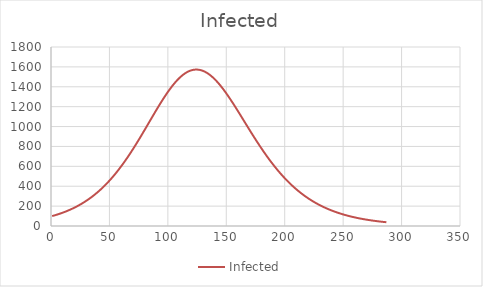
| Category | Infected |
|---|---|
| 1.0 | 100 |
| 2.0 | 103.313 |
| 3.0 | 106.732 |
| 4.0 | 110.26 |
| 5.0 | 113.9 |
| 6.0 | 117.654 |
| 7.0 | 121.528 |
| 8.0 | 125.523 |
| 9.0 | 129.643 |
| 10.0 | 133.892 |
| 11.0 | 138.273 |
| 12.0 | 142.79 |
| 13.0 | 147.447 |
| 14.0 | 152.248 |
| 15.0 | 157.196 |
| 16.0 | 162.295 |
| 17.0 | 167.549 |
| 18.0 | 172.963 |
| 19.0 | 178.54 |
| 20.0 | 184.284 |
| 21.0 | 190.201 |
| 22.0 | 196.293 |
| 23.0 | 202.565 |
| 24.0 | 209.023 |
| 25.0 | 215.669 |
| 26.0 | 222.509 |
| 27.0 | 229.546 |
| 28.0 | 236.786 |
| 29.0 | 244.233 |
| 30.0 | 251.891 |
| 31.0 | 259.765 |
| 32.0 | 267.859 |
| 33.0 | 276.177 |
| 34.0 | 284.725 |
| 35.0 | 293.506 |
| 36.0 | 302.525 |
| 37.0 | 311.786 |
| 38.0 | 321.294 |
| 39.0 | 331.052 |
| 40.0 | 341.064 |
| 41.0 | 351.334 |
| 42.0 | 361.867 |
| 43.0 | 372.666 |
| 44.0 | 383.733 |
| 45.0 | 395.074 |
| 46.0 | 406.69 |
| 47.0 | 418.584 |
| 48.0 | 430.76 |
| 49.0 | 443.219 |
| 50.0 | 455.963 |
| 51.0 | 468.996 |
| 52.0 | 482.317 |
| 53.0 | 495.929 |
| 54.0 | 509.831 |
| 55.0 | 524.024 |
| 56.0 | 538.509 |
| 57.0 | 553.285 |
| 58.0 | 568.35 |
| 59.0 | 583.704 |
| 60.0 | 599.343 |
| 61.0 | 615.267 |
| 62.0 | 631.471 |
| 63.0 | 647.952 |
| 64.0 | 664.705 |
| 65.0 | 681.725 |
| 66.0 | 699.007 |
| 67.0 | 716.545 |
| 68.0 | 734.33 |
| 69.0 | 752.355 |
| 70.0 | 770.611 |
| 71.0 | 789.089 |
| 72.0 | 807.778 |
| 73.0 | 826.667 |
| 74.0 | 845.744 |
| 75.0 | 864.995 |
| 76.0 | 884.408 |
| 77.0 | 903.967 |
| 78.0 | 923.657 |
| 79.0 | 943.461 |
| 80.0 | 963.362 |
| 81.0 | 983.341 |
| 82.0 | 1003.38 |
| 83.0 | 1023.458 |
| 84.0 | 1043.554 |
| 85.0 | 1063.647 |
| 86.0 | 1083.714 |
| 87.0 | 1103.732 |
| 88.0 | 1123.676 |
| 89.0 | 1143.523 |
| 90.0 | 1163.247 |
| 91.0 | 1182.822 |
| 92.0 | 1202.221 |
| 93.0 | 1221.417 |
| 94.0 | 1240.384 |
| 95.0 | 1259.093 |
| 96.0 | 1277.517 |
| 97.0 | 1295.627 |
| 98.0 | 1313.395 |
| 99.0 | 1330.793 |
| 100.0 | 1347.792 |
| 101.0 | 1364.365 |
| 102.0 | 1380.484 |
| 103.0 | 1396.12 |
| 104.0 | 1411.248 |
| 105.0 | 1425.84 |
| 106.0 | 1439.87 |
| 107.0 | 1453.314 |
| 108.0 | 1466.147 |
| 109.0 | 1478.345 |
| 110.0 | 1489.887 |
| 111.0 | 1500.749 |
| 112.0 | 1510.913 |
| 113.0 | 1520.359 |
| 114.0 | 1529.07 |
| 115.0 | 1537.03 |
| 116.0 | 1544.222 |
| 117.0 | 1550.635 |
| 118.0 | 1556.257 |
| 119.0 | 1561.077 |
| 120.0 | 1565.087 |
| 121.0 | 1568.281 |
| 122.0 | 1570.653 |
| 123.0 | 1572.2 |
| 124.0 | 1572.92 |
| 125.0 | 1572.814 |
| 126.0 | 1571.884 |
| 127.0 | 1570.134 |
| 128.0 | 1567.568 |
| 129.0 | 1564.193 |
| 130.0 | 1560.02 |
| 131.0 | 1555.057 |
| 132.0 | 1549.317 |
| 133.0 | 1542.812 |
| 134.0 | 1535.558 |
| 135.0 | 1527.571 |
| 136.0 | 1518.868 |
| 137.0 | 1509.468 |
| 138.0 | 1499.39 |
| 139.0 | 1488.655 |
| 140.0 | 1477.284 |
| 141.0 | 1465.302 |
| 142.0 | 1452.729 |
| 143.0 | 1439.592 |
| 144.0 | 1425.915 |
| 145.0 | 1411.721 |
| 146.0 | 1397.039 |
| 147.0 | 1381.892 |
| 148.0 | 1366.309 |
| 149.0 | 1350.314 |
| 150.0 | 1333.934 |
| 151.0 | 1317.197 |
| 152.0 | 1300.128 |
| 153.0 | 1282.754 |
| 154.0 | 1265.1 |
| 155.0 | 1247.194 |
| 156.0 | 1229.059 |
| 157.0 | 1210.722 |
| 158.0 | 1192.207 |
| 159.0 | 1173.537 |
| 160.0 | 1154.738 |
| 161.0 | 1135.832 |
| 162.0 | 1116.84 |
| 163.0 | 1097.786 |
| 164.0 | 1078.691 |
| 165.0 | 1059.573 |
| 166.0 | 1040.455 |
| 167.0 | 1021.353 |
| 168.0 | 1002.287 |
| 169.0 | 983.274 |
| 170.0 | 964.33 |
| 171.0 | 945.472 |
| 172.0 | 926.714 |
| 173.0 | 908.071 |
| 174.0 | 889.557 |
| 175.0 | 871.184 |
| 176.0 | 852.964 |
| 177.0 | 834.908 |
| 178.0 | 817.027 |
| 179.0 | 799.331 |
| 180.0 | 781.829 |
| 181.0 | 764.53 |
| 182.0 | 747.44 |
| 183.0 | 730.567 |
| 184.0 | 713.918 |
| 185.0 | 697.498 |
| 186.0 | 681.313 |
| 187.0 | 665.367 |
| 188.0 | 649.664 |
| 189.0 | 634.209 |
| 190.0 | 619.003 |
| 191.0 | 604.05 |
| 192.0 | 589.351 |
| 193.0 | 574.909 |
| 194.0 | 560.724 |
| 195.0 | 546.798 |
| 196.0 | 533.13 |
| 197.0 | 519.722 |
| 198.0 | 506.572 |
| 199.0 | 493.681 |
| 200.0 | 481.047 |
| 201.0 | 468.67 |
| 202.0 | 456.547 |
| 203.0 | 444.678 |
| 204.0 | 433.06 |
| 205.0 | 421.691 |
| 206.0 | 410.57 |
| 207.0 | 399.693 |
| 208.0 | 389.059 |
| 209.0 | 378.664 |
| 210.0 | 368.505 |
| 211.0 | 358.58 |
| 212.0 | 348.886 |
| 213.0 | 339.418 |
| 214.0 | 330.175 |
| 215.0 | 321.151 |
| 216.0 | 312.345 |
| 217.0 | 303.753 |
| 218.0 | 295.37 |
| 219.0 | 287.194 |
| 220.0 | 279.22 |
| 221.0 | 271.446 |
| 222.0 | 263.867 |
| 223.0 | 256.48 |
| 224.0 | 249.281 |
| 225.0 | 242.266 |
| 226.0 | 235.432 |
| 227.0 | 228.775 |
| 228.0 | 222.291 |
| 229.0 | 215.977 |
| 230.0 | 209.829 |
| 231.0 | 203.843 |
| 232.0 | 198.016 |
| 233.0 | 192.345 |
| 234.0 | 186.826 |
| 235.0 | 181.455 |
| 236.0 | 176.229 |
| 237.0 | 171.145 |
| 238.0 | 166.199 |
| 239.0 | 161.388 |
| 240.0 | 156.71 |
| 241.0 | 152.159 |
| 242.0 | 147.735 |
| 243.0 | 143.433 |
| 244.0 | 139.25 |
| 245.0 | 135.184 |
| 246.0 | 131.231 |
| 247.0 | 127.389 |
| 248.0 | 123.655 |
| 249.0 | 120.026 |
| 250.0 | 116.5 |
| 251.0 | 113.073 |
| 252.0 | 109.743 |
| 253.0 | 106.509 |
| 254.0 | 103.366 |
| 255.0 | 100.313 |
| 256.0 | 97.347 |
| 257.0 | 94.466 |
| 258.0 | 91.668 |
| 259.0 | 88.951 |
| 260.0 | 86.312 |
| 261.0 | 83.749 |
| 262.0 | 81.26 |
| 263.0 | 78.843 |
| 264.0 | 76.496 |
| 265.0 | 74.218 |
| 266.0 | 72.006 |
| 267.0 | 69.858 |
| 268.0 | 67.773 |
| 269.0 | 65.749 |
| 270.0 | 63.784 |
| 271.0 | 61.877 |
| 272.0 | 60.026 |
| 273.0 | 58.229 |
| 274.0 | 56.485 |
| 275.0 | 54.792 |
| 276.0 | 53.149 |
| 277.0 | 51.555 |
| 278.0 | 50.008 |
| 279.0 | 48.506 |
| 280.0 | 47.049 |
| 281.0 | 45.635 |
| 282.0 | 44.263 |
| 283.0 | 42.931 |
| 284.0 | 41.639 |
| 285.0 | 40.386 |
| 286.0 | 39.17 |
| 287.0 | 37.99 |